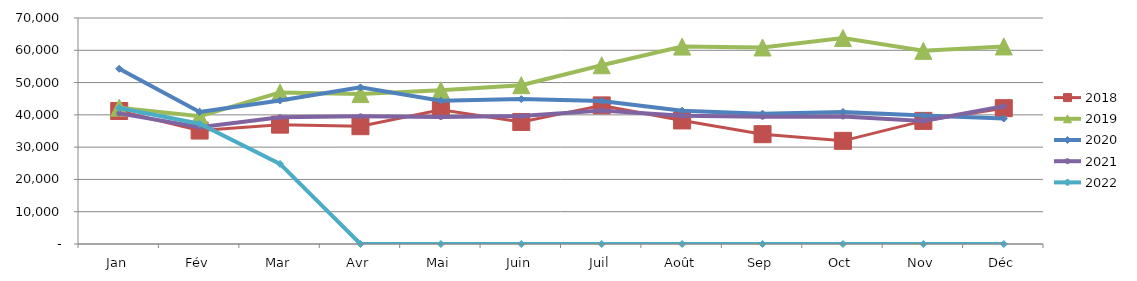
| Category | 2018 | 2019 | 2020 | 2021 | 2022 |
|---|---|---|---|---|---|
| Jan | 41189.736 | 42238.432 | 54273.068 | 40458.51 | 42125.233 |
| Fév | 35137.047 | 39568.195 | 40883.319 | 36200.926 | 37242.7 |
| Mar | 36966.816 | 46942.202 | 44426.392 | 39262.158 | 24799.582 |
| Avr | 36485.223 | 46427.766 | 48509.843 | 39555.16 | 0 |
| Mai | 41558.724 | 47634.031 | 44407.424 | 39315.181 | 0 |
| Juin | 37797.134 | 49186.221 | 44874.513 | 39615.13 | 0 |
| Juil | 42927.847 | 55367.883 | 44316.236 | 41338.163 | 0 |
| Août | 38263.165 | 61146.365 | 41285.559 | 39690.432 | 0 |
| Sep | 34011.672 | 60874.85 | 40379.909 | 39412.556 | 0 |
| Oct | 31946.792 | 63789.634 | 40903.528 | 39474.624 | 0 |
| Nov | 38139.513 | 59829.208 | 39772.437 | 38089.775 | 0 |
| Déc | 42064.579 | 61190.831 | 38851.183 | 42639.837 | 0 |